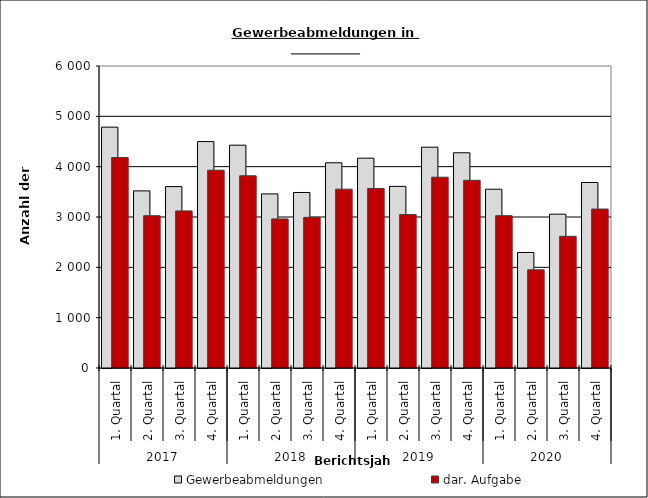
| Category | Gewerbeabmeldungen | dar. Aufgabe |
|---|---|---|
| 0 | 4785 | 4182 |
| 1 | 3519 | 3026 |
| 2 | 3604 | 3121 |
| 3 | 4499 | 3930 |
| 4 | 4427 | 3819 |
| 5 | 3459 | 2962 |
| 6 | 3487 | 2994 |
| 7 | 4077 | 3553 |
| 8 | 4169 | 3567 |
| 9 | 3609 | 3048 |
| 10 | 4387 | 3791 |
| 11 | 4276 | 3729 |
| 12 | 3552 | 3027 |
| 13 | 2295 | 1951 |
| 14 | 3056 | 2616 |
| 15 | 3686 | 3158 |